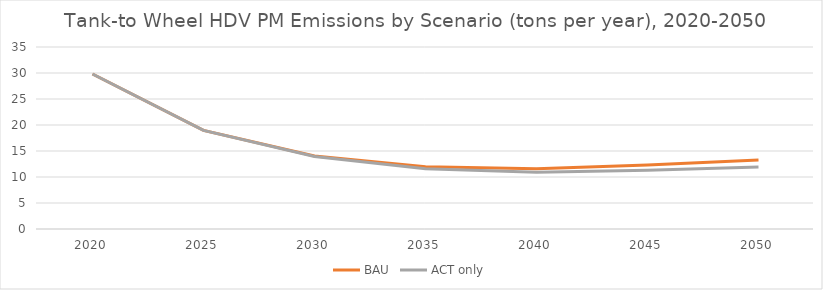
| Category | BAU | ACT only |
|---|---|---|
| 2020.0 | 29.808 | 29.808 |
| 2025.0 | 18.968 | 18.968 |
| 2030.0 | 14.049 | 13.949 |
| 2035.0 | 11.994 | 11.599 |
| 2040.0 | 11.581 | 10.898 |
| 2045.0 | 12.31 | 11.295 |
| 2050.0 | 13.249 | 11.936 |